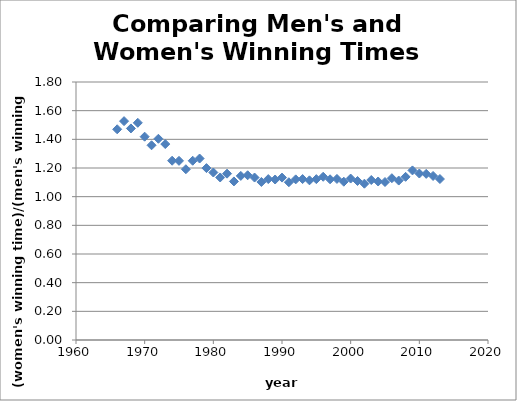
| Category | Series 0 |
|---|---|
| 1966.0 | 1.47 |
| 1967.0 | 1.527 |
| 1968.0 | 1.476 |
| 1969.0 | 1.515 |
| 1970.0 | 1.419 |
| 1971.0 | 1.359 |
| 1972.0 | 1.404 |
| 1973.0 | 1.367 |
| 1974.0 | 1.251 |
| 1975.0 | 1.25 |
| 1976.0 | 1.191 |
| 1977.0 | 1.251 |
| 1978.0 | 1.266 |
| 1979.0 | 1.199 |
| 1980.0 | 1.169 |
| 1981.0 | 1.134 |
| 1982.0 | 1.161 |
| 1983.0 | 1.106 |
| 1984.0 | 1.145 |
| 1985.0 | 1.149 |
| 1986.0 | 1.133 |
| 1987.0 | 1.103 |
| 1988.0 | 1.123 |
| 1989.0 | 1.12 |
| 1990.0 | 1.133 |
| 1991.0 | 1.101 |
| 1992.0 | 1.121 |
| 1993.0 | 1.123 |
| 1994.0 | 1.114 |
| 1995.0 | 1.122 |
| 1996.0 | 1.139 |
| 1997.0 | 1.121 |
| 1998.0 | 1.124 |
| 1999.0 | 1.104 |
| 2000.0 | 1.126 |
| 2001.0 | 1.109 |
| 2002.0 | 1.091 |
| 2003.0 | 1.116 |
| 2004.0 | 1.106 |
| 2005.0 | 1.102 |
| 2006.0 | 1.129 |
| 2007.0 | 1.112 |
| 2008.0 | 1.138 |
| 2009.0 | 1.183 |
| 2010.0 | 1.161 |
| 2011.0 | 1.159 |
| 2012.0 | 1.144 |
| 2013.0 | 1.123 |